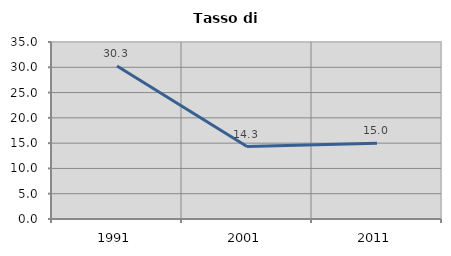
| Category | Tasso di disoccupazione   |
|---|---|
| 1991.0 | 30.25 |
| 2001.0 | 14.327 |
| 2011.0 | 14.985 |